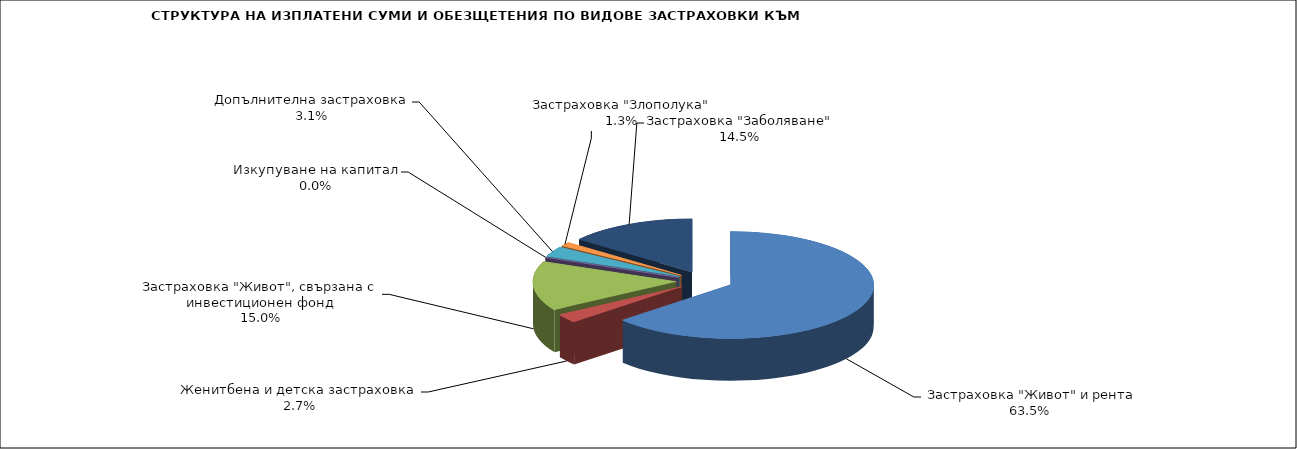
| Category |  Застраховка "Живот" и рента |
|---|---|
|  Застраховка "Живот" и рента | 124800805.656 |
| Женитбена и детска застраховка | 5207192.447 |
| Застраховка "Живот", свързана с инвестиционен фонд | 29414784.968 |
| Изкупуване на капитал | 0 |
| Допълнителна застраховка | 6109261.785 |
| Застраховка "Злополука" | 2493807.742 |
| Застраховка "Заболяване" | 28446213.883 |